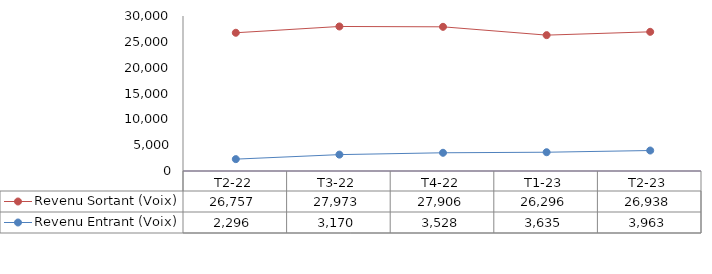
| Category | Revenu Sortant (Voix) | Revenu Entrant (Voix) |
|---|---|---|
| T2-22 | 26756.839 | 2295.508 |
| T3-22 | 27973.147 | 3170.368 |
| T4-22 | 27905.637 | 3527.527 |
| T1-23 | 26296.452 | 3634.96 |
| T2-23 | 26937.819 | 3962.803 |